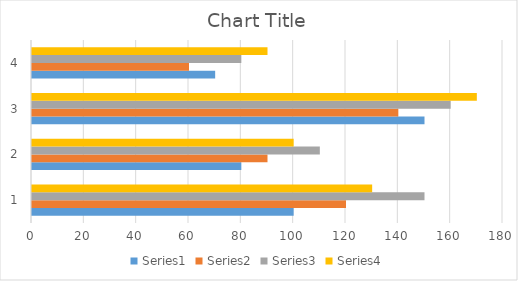
| Category | Series 0 | Series 1 | Series 2 | Series 3 |
|---|---|---|---|---|
| 0 | 100 | 120 | 150 | 130 |
| 1 | 80 | 90 | 110 | 100 |
| 2 | 150 | 140 | 160 | 170 |
| 3 | 70 | 60 | 80 | 90 |